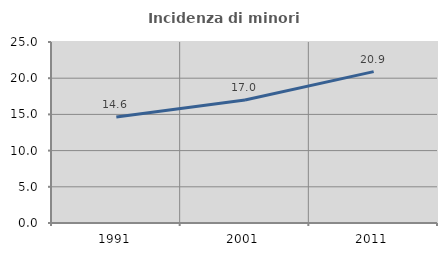
| Category | Incidenza di minori stranieri |
|---|---|
| 1991.0 | 14.634 |
| 2001.0 | 16.981 |
| 2011.0 | 20.909 |